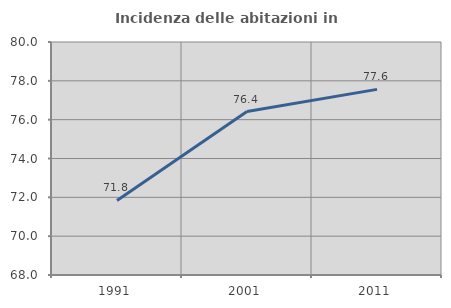
| Category | Incidenza delle abitazioni in proprietà  |
|---|---|
| 1991.0 | 71.84 |
| 2001.0 | 76.42 |
| 2011.0 | 77.559 |